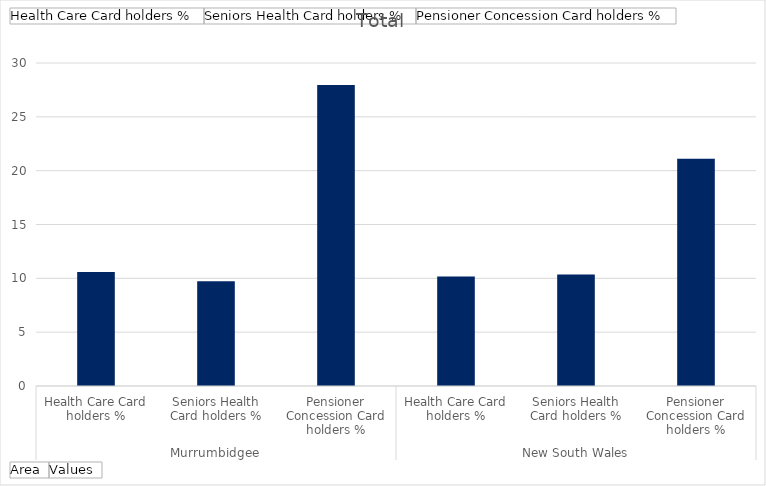
| Category | Total |
|---|---|
| 0 | 10.589 |
| 1 | 9.723 |
| 2 | 27.952 |
| 3 | 10.166 |
| 4 | 10.353 |
| 5 | 21.108 |